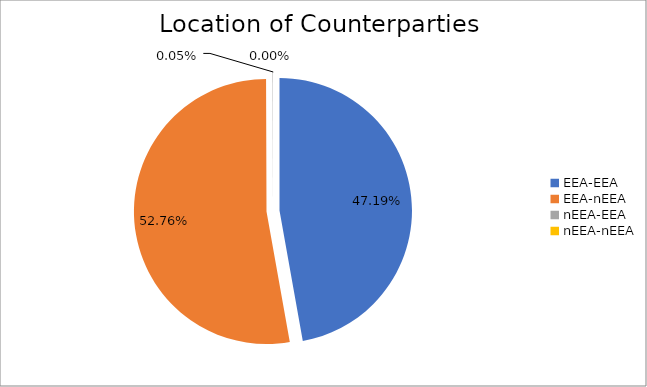
| Category | Series 0 |
|---|---|
| EEA-EEA | 6242249.83 |
| EEA-nEEA | 6979958.736 |
| nEEA-EEA | 6698.241 |
| nEEA-nEEA | 288.25 |